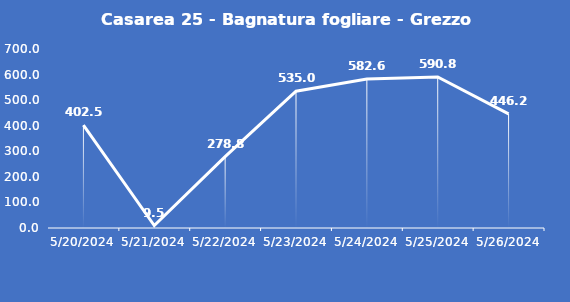
| Category | Casarea 25 - Bagnatura fogliare - Grezzo (min) |
|---|---|
| 5/20/24 | 402.5 |
| 5/21/24 | 9.5 |
| 5/22/24 | 278.8 |
| 5/23/24 | 535 |
| 5/24/24 | 582.6 |
| 5/25/24 | 590.8 |
| 5/26/24 | 446.2 |